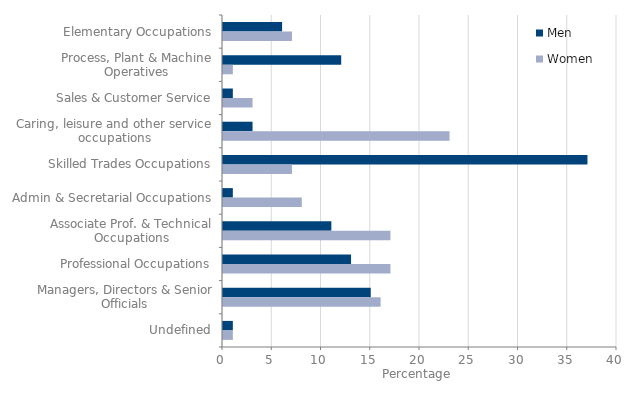
| Category | Men | Women |
|---|---|---|
| Elementary Occupations | 6 | 7 |
| Process, Plant & Machine Operatives | 12 | 1 |
| Sales & Customer Service | 1 | 3 |
| Caring, leisure and other service occupations | 3 | 23 |
| Skilled Trades Occupations | 37 | 7 |
| Admin & Secretarial Occupations | 1 | 8 |
| Associate Prof. & Technical Occupations | 11 | 17 |
| Professional Occupations | 13 | 17 |
| Managers, Directors & Senior Officials | 15 | 16 |
| Undefined | 1 | 1 |